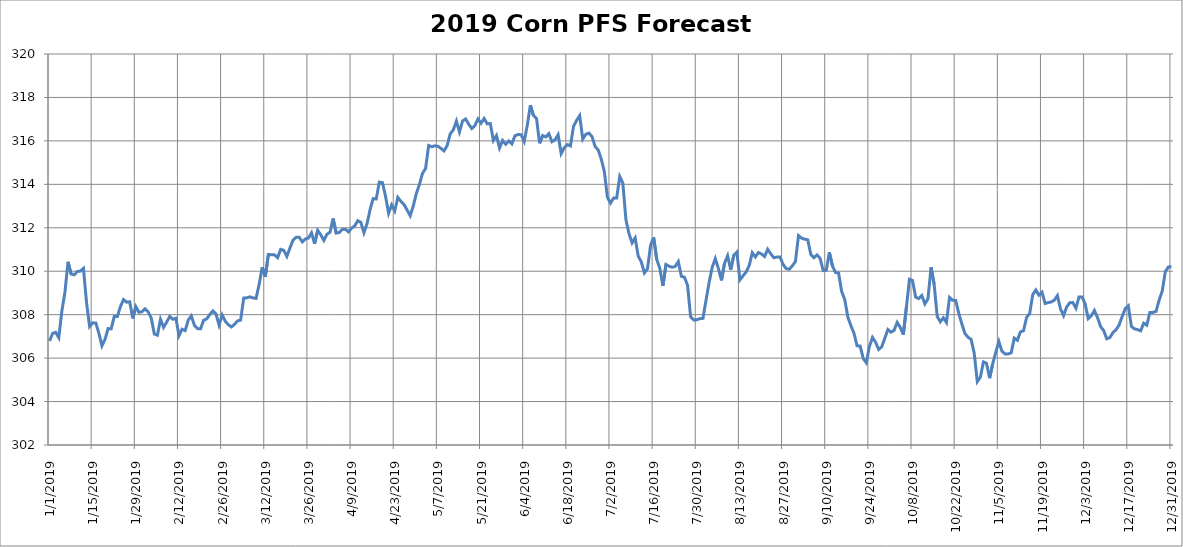
| Category | 2019 Corn PFS Forecast Model |
|---|---|
| 01/01/2019 | 306.786 |
| 02/01/2019 | 307.134 |
| 03/01/2019 | 307.182 |
| 04/01/2019 | 306.944 |
| 05/01/2019 | 308.171 |
| 06/01/2019 | 309.042 |
| 07/01/2019 | 310.433 |
| 08/01/2019 | 309.872 |
| 09/01/2019 | 309.833 |
| 10/01/2019 | 309.99 |
| 11/01/2019 | 310.004 |
| 12/01/2019 | 310.131 |
| 13/01/2019 | 308.56 |
| 14/01/2019 | 307.451 |
| 15/01/2019 | 307.622 |
| 16/01/2019 | 307.621 |
| 17/01/2019 | 307.151 |
| 18/01/2019 | 306.566 |
| 19/01/2019 | 306.866 |
| 20/01/2019 | 307.361 |
| 21/01/2019 | 307.348 |
| 22/01/2019 | 307.919 |
| 23/01/2019 | 307.915 |
| 24/01/2019 | 308.374 |
| 25/01/2019 | 308.695 |
| 26/01/2019 | 308.575 |
| 27/01/2019 | 308.593 |
| 28/01/2019 | 307.829 |
| 29/01/2019 | 308.369 |
| 30/01/2019 | 308.109 |
| 31/01/2019 | 308.135 |
| 01/02/2019 | 308.271 |
| 02/02/2019 | 308.13 |
| 03/02/2019 | 307.845 |
| 04/02/2019 | 307.106 |
| 05/02/2019 | 307.056 |
| 06/02/2019 | 307.787 |
| 07/02/2019 | 307.414 |
| 08/02/2019 | 307.659 |
| 09/02/2019 | 307.918 |
| 10/02/2019 | 307.787 |
| 11/02/2019 | 307.833 |
| 12/02/2019 | 307.035 |
| 13/02/2019 | 307.329 |
| 14/02/2019 | 307.266 |
| 15/02/2019 | 307.752 |
| 16/02/2019 | 307.944 |
| 17/02/2019 | 307.505 |
| 18/02/2019 | 307.358 |
| 19/02/2019 | 307.351 |
| 20/02/2019 | 307.743 |
| 21/02/2019 | 307.806 |
| 22/02/2019 | 308.006 |
| 23/02/2019 | 308.174 |
| 24/02/2019 | 308.038 |
| 25/02/2019 | 307.518 |
| 26/02/2019 | 307.99 |
| 27/02/2019 | 307.699 |
| 28/02/2019 | 307.537 |
| 01/03/2019 | 307.435 |
| 02/03/2019 | 307.555 |
| 03/03/2019 | 307.711 |
| 04/03/2019 | 307.752 |
| 05/03/2019 | 308.763 |
| 06/03/2019 | 308.775 |
| 07/03/2019 | 308.82 |
| 08/03/2019 | 308.774 |
| 09/03/2019 | 308.747 |
| 10/03/2019 | 309.395 |
| 11/03/2019 | 310.187 |
| 12/03/2019 | 309.744 |
| 13/03/2019 | 310.771 |
| 14/03/2019 | 310.76 |
| 15/03/2019 | 310.757 |
| 16/03/2019 | 310.622 |
| 17/03/2019 | 311.007 |
| 18/03/2019 | 310.959 |
| 19/03/2019 | 310.686 |
| 20/03/2019 | 311.072 |
| 21/03/2019 | 311.431 |
| 22/03/2019 | 311.562 |
| 23/03/2019 | 311.566 |
| 24/03/2019 | 311.351 |
| 25/03/2019 | 311.485 |
| 26/03/2019 | 311.528 |
| 27/03/2019 | 311.771 |
| 28/03/2019 | 311.267 |
| 29/03/2019 | 311.884 |
| 30/03/2019 | 311.68 |
| 31/03/2019 | 311.418 |
| 01/04/2019 | 311.702 |
| 02/04/2019 | 311.795 |
| 03/04/2019 | 312.427 |
| 04/04/2019 | 311.755 |
| 05/04/2019 | 311.78 |
| 06/04/2019 | 311.924 |
| 07/04/2019 | 311.932 |
| 08/04/2019 | 311.811 |
| 09/04/2019 | 311.988 |
| 10/04/2019 | 312.083 |
| 11/04/2019 | 312.324 |
| 12/04/2019 | 312.248 |
| 13/04/2019 | 311.769 |
| 14/04/2019 | 312.185 |
| 15/04/2019 | 312.839 |
| 16/04/2019 | 313.343 |
| 17/04/2019 | 313.325 |
| 18/04/2019 | 314.102 |
| 19/04/2019 | 314.078 |
| 20/04/2019 | 313.462 |
| 21/04/2019 | 312.666 |
| 22/04/2019 | 313.05 |
| 23/04/2019 | 312.777 |
| 24/04/2019 | 313.398 |
| 25/04/2019 | 313.22 |
| 26/04/2019 | 313.071 |
| 27/04/2019 | 312.821 |
| 28/04/2019 | 312.554 |
| 29/04/2019 | 312.997 |
| 30/04/2019 | 313.573 |
| 01/05/2019 | 313.989 |
| 02/05/2019 | 314.503 |
| 03/05/2019 | 314.728 |
| 04/05/2019 | 315.788 |
| 05/05/2019 | 315.728 |
| 06/05/2019 | 315.774 |
| 07/05/2019 | 315.75 |
| 08/05/2019 | 315.655 |
| 09/05/2019 | 315.539 |
| 10/05/2019 | 315.783 |
| 11/05/2019 | 316.328 |
| 12/05/2019 | 316.505 |
| 13/05/2019 | 316.912 |
| 14/05/2019 | 316.413 |
| 15/05/2019 | 316.918 |
| 16/05/2019 | 317.008 |
| 17/05/2019 | 316.769 |
| 18/05/2019 | 316.568 |
| 19/05/2019 | 316.704 |
| 20/05/2019 | 317.011 |
| 21/05/2019 | 316.81 |
| 22/05/2019 | 317.031 |
| 23/05/2019 | 316.785 |
| 24/05/2019 | 316.801 |
| 25/05/2019 | 316.018 |
| 26/05/2019 | 316.248 |
| 27/05/2019 | 315.671 |
| 28/05/2019 | 316.022 |
| 29/05/2019 | 315.842 |
| 30/05/2019 | 316 |
| 31/05/2019 | 315.864 |
| 01/06/2019 | 316.233 |
| 02/06/2019 | 316.294 |
| 03/06/2019 | 316.285 |
| 04/06/2019 | 315.976 |
| 05/06/2019 | 316.718 |
| 06/06/2019 | 317.647 |
| 07/06/2019 | 317.168 |
| 08/06/2019 | 317.029 |
| 09/06/2019 | 315.89 |
| 10/06/2019 | 316.248 |
| 11/06/2019 | 316.181 |
| 12/06/2019 | 316.333 |
| 13/06/2019 | 315.961 |
| 14/06/2019 | 316.046 |
| 15/06/2019 | 316.286 |
| 16/06/2019 | 315.411 |
| 17/06/2019 | 315.687 |
| 18/06/2019 | 315.829 |
| 19/06/2019 | 315.768 |
| 20/06/2019 | 316.666 |
| 21/06/2019 | 316.944 |
| 22/06/2019 | 317.164 |
| 23/06/2019 | 316.08 |
| 24/06/2019 | 316.305 |
| 25/06/2019 | 316.358 |
| 26/06/2019 | 316.194 |
| 27/06/2019 | 315.744 |
| 28/06/2019 | 315.58 |
| 29/06/2019 | 315.165 |
| 30/06/2019 | 314.585 |
| 01/07/2019 | 313.399 |
| 02/07/2019 | 313.138 |
| 03/07/2019 | 313.367 |
| 04/07/2019 | 313.367 |
| 05/07/2019 | 314.359 |
| 06/07/2019 | 314.061 |
| 07/07/2019 | 312.373 |
| 08/07/2019 | 311.727 |
| 09/07/2019 | 311.302 |
| 10/07/2019 | 311.534 |
| 11/07/2019 | 310.692 |
| 12/07/2019 | 310.427 |
| 13/07/2019 | 309.918 |
| 14/07/2019 | 310.107 |
| 15/07/2019 | 311.192 |
| 16/07/2019 | 311.557 |
| 17/07/2019 | 310.546 |
| 18/07/2019 | 310.132 |
| 19/07/2019 | 309.325 |
| 20/07/2019 | 310.311 |
| 21/07/2019 | 310.228 |
| 22/07/2019 | 310.182 |
| 23/07/2019 | 310.223 |
| 24/07/2019 | 310.444 |
| 25/07/2019 | 309.766 |
| 26/07/2019 | 309.721 |
| 27/07/2019 | 309.353 |
| 28/07/2019 | 307.897 |
| 29/07/2019 | 307.755 |
| 30/07/2019 | 307.762 |
| 31/07/2019 | 307.818 |
| 01/08/2019 | 307.832 |
| 02/08/2019 | 308.674 |
| 03/08/2019 | 309.489 |
| 04/08/2019 | 310.178 |
| 05/08/2019 | 310.579 |
| 06/08/2019 | 310.128 |
| 07/08/2019 | 309.579 |
| 08/08/2019 | 310.365 |
| 09/08/2019 | 310.712 |
| 10/08/2019 | 310.071 |
| 11/08/2019 | 310.735 |
| 12/08/2019 | 310.876 |
| 13/08/2019 | 309.603 |
| 14/08/2019 | 309.789 |
| 15/08/2019 | 309.962 |
| 16/08/2019 | 310.262 |
| 17/08/2019 | 310.852 |
| 18/08/2019 | 310.658 |
| 19/08/2019 | 310.861 |
| 20/08/2019 | 310.793 |
| 21/08/2019 | 310.68 |
| 22/08/2019 | 311.011 |
| 23/08/2019 | 310.801 |
| 24/08/2019 | 310.622 |
| 25/08/2019 | 310.65 |
| 26/08/2019 | 310.655 |
| 27/08/2019 | 310.312 |
| 28/08/2019 | 310.119 |
| 29/08/2019 | 310.09 |
| 30/08/2019 | 310.25 |
| 31/08/2019 | 310.445 |
| 01/09/2019 | 311.64 |
| 02/09/2019 | 311.524 |
| 03/09/2019 | 311.476 |
| 04/09/2019 | 311.446 |
| 05/09/2019 | 310.765 |
| 06/09/2019 | 310.622 |
| 07/09/2019 | 310.75 |
| 08/09/2019 | 310.597 |
| 09/09/2019 | 310.029 |
| 10/09/2019 | 310.043 |
| 11/09/2019 | 310.866 |
| 12/09/2019 | 310.247 |
| 13/09/2019 | 309.942 |
| 14/09/2019 | 309.914 |
| 15/09/2019 | 309.067 |
| 16/09/2019 | 308.693 |
| 17/09/2019 | 307.893 |
| 18/09/2019 | 307.494 |
| 19/09/2019 | 307.139 |
| 20/09/2019 | 306.569 |
| 21/09/2019 | 306.555 |
| 22/09/2019 | 305.98 |
| 23/09/2019 | 305.788 |
| 24/09/2019 | 306.536 |
| 25/09/2019 | 306.949 |
| 26/09/2019 | 306.736 |
| 27/09/2019 | 306.397 |
| 28/09/2019 | 306.521 |
| 29/09/2019 | 306.917 |
| 30/09/2019 | 307.317 |
| 01/10/2019 | 307.193 |
| 02/10/2019 | 307.278 |
| 03/10/2019 | 307.644 |
| 04/10/2019 | 307.414 |
| 05/10/2019 | 307.082 |
| 06/10/2019 | 308.34 |
| 07/10/2019 | 309.63 |
| 08/10/2019 | 309.572 |
| 09/10/2019 | 308.808 |
| 10/10/2019 | 308.739 |
| 11/10/2019 | 308.882 |
| 12/10/2019 | 308.496 |
| 13/10/2019 | 308.731 |
| 14/10/2019 | 310.18 |
| 15/10/2019 | 309.399 |
| 16/10/2019 | 307.918 |
| 17/10/2019 | 307.671 |
| 18/10/2019 | 307.856 |
| 19/10/2019 | 307.639 |
| 20/10/2019 | 308.794 |
| 21/10/2019 | 308.661 |
| 22/10/2019 | 308.656 |
| 23/10/2019 | 308.053 |
| 24/10/2019 | 307.572 |
| 25/10/2019 | 307.131 |
| 26/10/2019 | 306.962 |
| 27/10/2019 | 306.861 |
| 28/10/2019 | 306.232 |
| 29/10/2019 | 304.917 |
| 30/10/2019 | 305.121 |
| 31/10/2019 | 305.828 |
| 01/11/2019 | 305.758 |
| 02/11/2019 | 305.077 |
| 03/11/2019 | 305.733 |
| 04/11/2019 | 306.271 |
| 05/11/2019 | 306.766 |
| 06/11/2019 | 306.316 |
| 07/11/2019 | 306.194 |
| 08/11/2019 | 306.195 |
| 09/11/2019 | 306.24 |
| 10/11/2019 | 306.921 |
| 11/11/2019 | 306.821 |
| 12/11/2019 | 307.208 |
| 13/11/2019 | 307.259 |
| 14/11/2019 | 307.876 |
| 15/11/2019 | 308.053 |
| 16/11/2019 | 308.922 |
| 17/11/2019 | 309.136 |
| 18/11/2019 | 308.898 |
| 19/11/2019 | 309.033 |
| 20/11/2019 | 308.514 |
| 21/11/2019 | 308.555 |
| 22/11/2019 | 308.585 |
| 23/11/2019 | 308.667 |
| 24/11/2019 | 308.877 |
| 25/11/2019 | 308.263 |
| 26/11/2019 | 307.958 |
| 27/11/2019 | 308.353 |
| 28/11/2019 | 308.547 |
| 29/11/2019 | 308.558 |
| 30/11/2019 | 308.299 |
| 01/12/2019 | 308.812 |
| 02/12/2019 | 308.817 |
| 03/12/2019 | 308.492 |
| 04/12/2019 | 307.816 |
| 05/12/2019 | 307.952 |
| 06/12/2019 | 308.192 |
| 07/12/2019 | 307.869 |
| 08/12/2019 | 307.454 |
| 09/12/2019 | 307.27 |
| 10/12/2019 | 306.89 |
| 11/12/2019 | 306.945 |
| 12/12/2019 | 307.174 |
| 13/12/2019 | 307.305 |
| 14/12/2019 | 307.521 |
| 15/12/2019 | 307.914 |
| 16/12/2019 | 308.278 |
| 17/12/2019 | 308.409 |
| 18/12/2019 | 307.459 |
| 19/12/2019 | 307.345 |
| 20/12/2019 | 307.314 |
| 21/12/2019 | 307.255 |
| 22/12/2019 | 307.61 |
| 23/12/2019 | 307.517 |
| 24/12/2019 | 308.105 |
| 25/12/2019 | 308.105 |
| 26/12/2019 | 308.151 |
| 27/12/2019 | 308.669 |
| 28/12/2019 | 309.082 |
| 29/12/2019 | 309.978 |
| 30/12/2019 | 310.196 |
| 31/12/2019 | 310.214 |